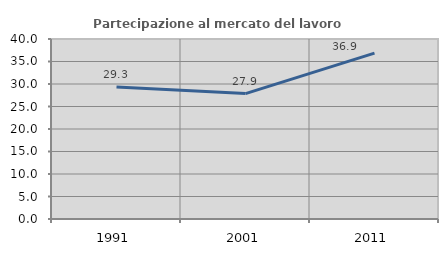
| Category | Partecipazione al mercato del lavoro  femminile |
|---|---|
| 1991.0 | 29.323 |
| 2001.0 | 27.866 |
| 2011.0 | 36.856 |